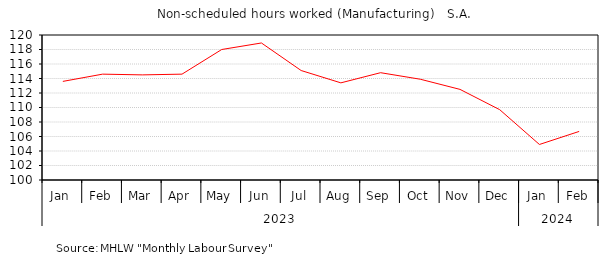
| Category | Series 0 |
|---|---|
| 0 | 113.6 |
| 1 | 114.6 |
| 2 | 114.5 |
| 3 | 114.6 |
| 4 | 118 |
| 5 | 118.9 |
| 6 | 115.1 |
| 7 | 113.4 |
| 8 | 114.8 |
| 9 | 113.9 |
| 10 | 112.5 |
| 11 | 109.7 |
| 12 | 104.9 |
| 13 | 106.7 |